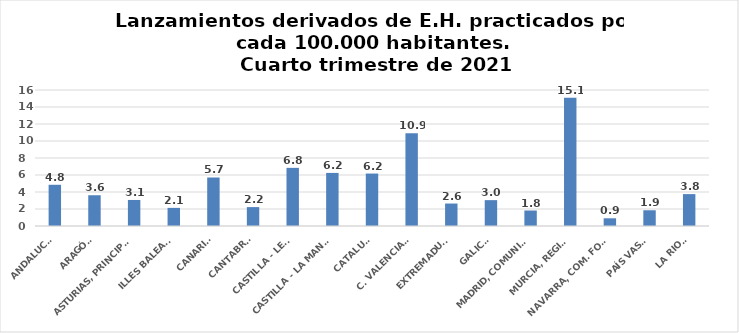
| Category | Series 0 |
|---|---|
| ANDALUCÍA | 4.848 |
| ARAGÓN | 3.619 |
| ASTURIAS, PRINCIPADO | 3.064 |
| ILLES BALEARS | 2.131 |
| CANARIAS | 5.707 |
| CANTABRIA | 2.224 |
| CASTILLA - LEÓN | 6.84 |
| CASTILLA - LA MANCHA | 6.245 |
| CATALUÑA | 6.17 |
| C. VALENCIANA | 10.913 |
| EXTREMADURA | 2.643 |
| GALICIA | 3.042 |
| MADRID, COMUNIDAD | 1.822 |
| MURCIA, REGIÓN | 15.081 |
| NAVARRA, COM. FORAL | 0.907 |
| PAÍS VASCO | 1.852 |
| LA RIOJA | 3.752 |